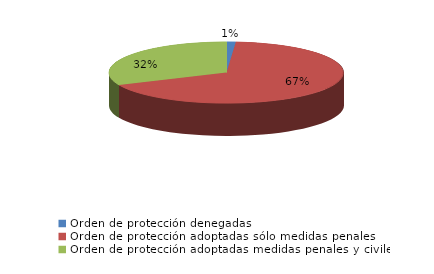
| Category | Series 0 |
|---|---|
| Orden de protección denegadas | 1 |
| Orden de protección adoptadas sólo medidas penales | 53 |
| Orden de protección adoptadas medidas penales y civiles | 25 |